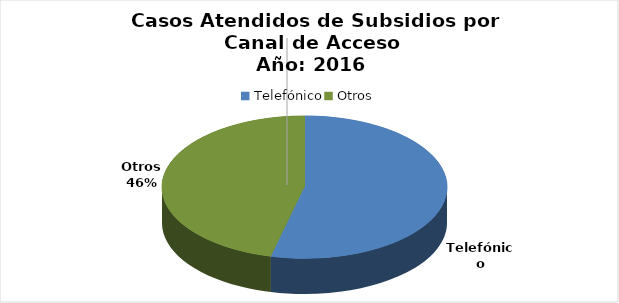
| Category | Total |
|---|---|
| Telefónico | 83814 |
| Otros | 72005 |